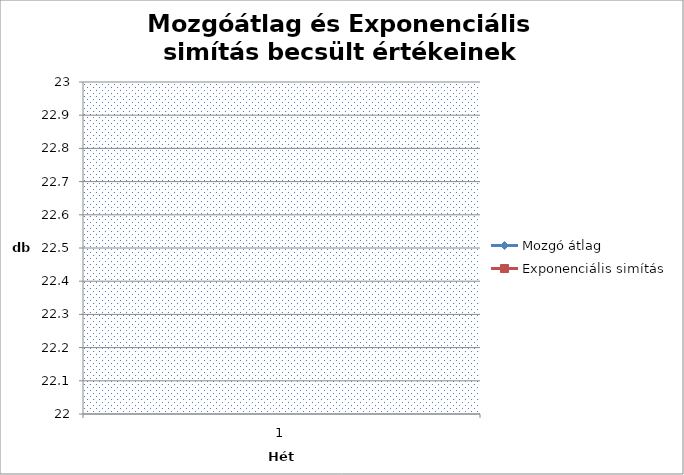
| Category | Mozgó átlag | Exponenciális simítás |
|---|---|---|
| 0 | 1 | 1 |